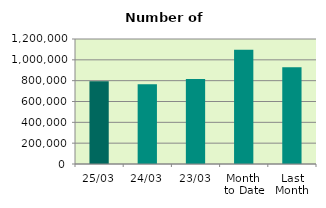
| Category | Series 0 |
|---|---|
| 25/03 | 793632 |
| 24/03 | 765428 |
| 23/03 | 816202 |
| Month 
to Date | 1096626.947 |
| Last
Month | 928647.7 |